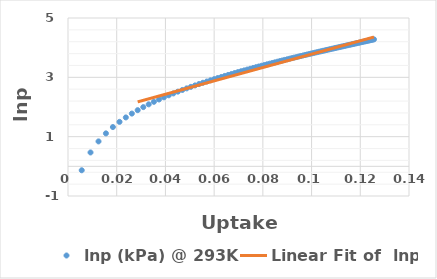
| Category | lnp (kPa) @ 293K |
|---|---|
| 0.00564 | -0.133 |
| 0.00925 | 0.468 |
| 0.01253 | 0.84 |
| 0.01557 | 1.111 |
| 0.01843 | 1.324 |
| 0.02115 | 1.499 |
| 0.02374 | 1.648 |
| 0.02622 | 1.778 |
| 0.02861 | 1.893 |
| 0.03091 | 1.996 |
| 0.03313 | 2.09 |
| 0.03528 | 2.175 |
| 0.03737 | 2.254 |
| 0.03939 | 2.327 |
| 0.04136 | 2.395 |
| 0.04327 | 2.458 |
| 0.04513 | 2.518 |
| 0.04695 | 2.574 |
| 0.04872 | 2.628 |
| 0.05044 | 2.679 |
| 0.05213 | 2.727 |
| 0.05377 | 2.773 |
| 0.05538 | 2.817 |
| 0.05696 | 2.859 |
| 0.0585 | 2.9 |
| 0.06001 | 2.939 |
| 0.06148 | 2.976 |
| 0.06293 | 3.012 |
| 0.06435 | 3.047 |
| 0.06574 | 3.081 |
| 0.06711 | 3.113 |
| 0.06845 | 3.145 |
| 0.06976 | 3.175 |
| 0.07105 | 3.205 |
| 0.07232 | 3.234 |
| 0.07357 | 3.262 |
| 0.07479 | 3.289 |
| 0.076 | 3.315 |
| 0.07718 | 3.341 |
| 0.07834 | 3.366 |
| 0.07949 | 3.391 |
| 0.08061 | 3.415 |
| 0.08172 | 3.438 |
| 0.08281 | 3.461 |
| 0.08388 | 3.484 |
| 0.08494 | 3.506 |
| 0.08598 | 3.527 |
| 0.08701 | 3.548 |
| 0.08802 | 3.568 |
| 0.08901 | 3.589 |
| 0.08999 | 3.608 |
| 0.09096 | 3.628 |
| 0.09191 | 3.647 |
| 0.09285 | 3.665 |
| 0.09378 | 3.683 |
| 0.09469 | 3.701 |
| 0.0956 | 3.719 |
| 0.09649 | 3.736 |
| 0.09736 | 3.753 |
| 0.09823 | 3.77 |
| 0.09908 | 3.787 |
| 0.09993 | 3.803 |
| 0.10076 | 3.819 |
| 0.10158 | 3.834 |
| 0.10239 | 3.85 |
| 0.10319 | 3.865 |
| 0.10399 | 3.88 |
| 0.10477 | 3.895 |
| 0.10554 | 3.909 |
| 0.1063 | 3.924 |
| 0.10706 | 3.938 |
| 0.1078 | 3.952 |
| 0.10854 | 3.966 |
| 0.10927 | 3.979 |
| 0.10998 | 3.993 |
| 0.11069 | 4.006 |
| 0.1114 | 4.019 |
| 0.11209 | 4.032 |
| 0.11278 | 4.044 |
| 0.11346 | 4.057 |
| 0.11413 | 4.069 |
| 0.11479 | 4.082 |
| 0.11545 | 4.094 |
| 0.1161 | 4.106 |
| 0.11674 | 4.117 |
| 0.11738 | 4.129 |
| 0.11801 | 4.141 |
| 0.11863 | 4.152 |
| 0.11925 | 4.163 |
| 0.11986 | 4.174 |
| 0.12046 | 4.185 |
| 0.12106 | 4.196 |
| 0.12165 | 4.207 |
| 0.12224 | 4.218 |
| 0.12282 | 4.228 |
| 0.12339 | 4.239 |
| 0.12396 | 4.249 |
| 0.12452 | 4.259 |
| 0.12508 | 4.27 |
| 0.12563 | 4.28 |